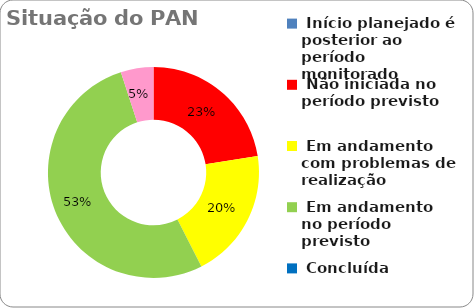
| Category | Series 0 |
|---|---|
|  Início planejado é posterior ao período monitorado | 0 |
|  Não iniciada no período previsto | 0.225 |
|  Em andamento com problemas de realização | 0.2 |
|  Em andamento no período previsto  | 0.525 |
|  Concluída | 0 |
|  Ações Novas - Pós monitoria | 0.05 |